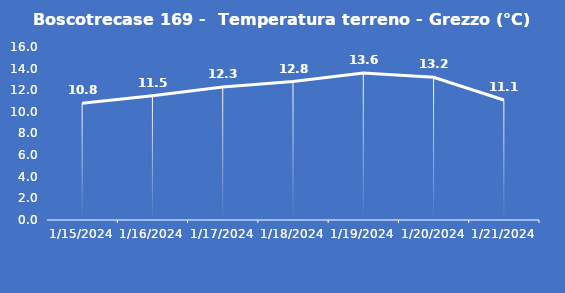
| Category | Boscotrecase 169 -  Temperatura terreno - Grezzo (°C) |
|---|---|
| 1/15/24 | 10.8 |
| 1/16/24 | 11.5 |
| 1/17/24 | 12.3 |
| 1/18/24 | 12.8 |
| 1/19/24 | 13.6 |
| 1/20/24 | 13.2 |
| 1/21/24 | 11.1 |